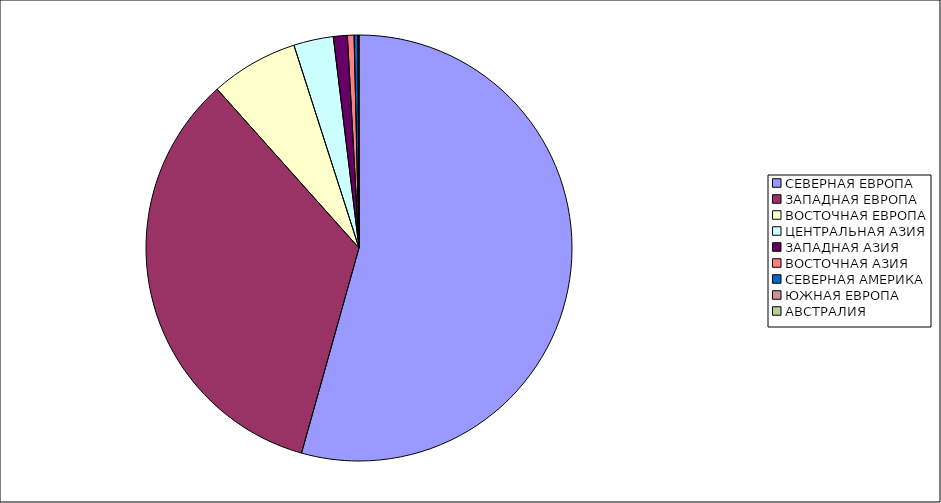
| Category | Оборот |
|---|---|
| СЕВЕРНАЯ ЕВРОПА | 54.348 |
| ЗАПАДНАЯ ЕВРОПА | 34.048 |
| ВОСТОЧНАЯ ЕВРОПА | 6.662 |
| ЦЕНТРАЛЬНАЯ АЗИЯ | 3.011 |
| ЗАПАДНАЯ АЗИЯ | 1.058 |
| ВОСТОЧНАЯ АЗИЯ | 0.504 |
| СЕВЕРНАЯ АМЕРИКА | 0.281 |
| ЮЖНАЯ ЕВРОПА | 0.061 |
| АВСТРАЛИЯ | 0.026 |